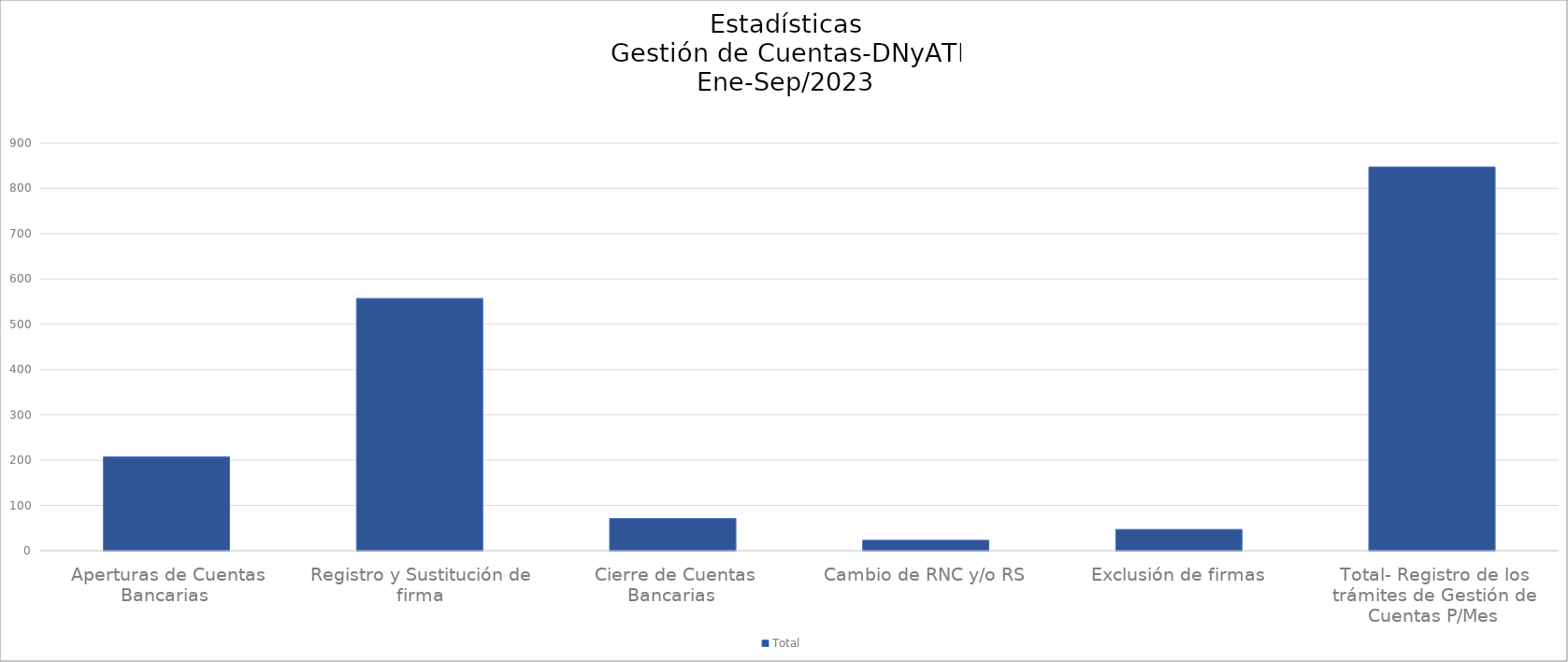
| Category | Total |
|---|---|
| Aperturas de Cuentas Bancarias  | 207 |
| Registro y Sustitución de firma | 557 |
| Cierre de Cuentas Bancarias  | 71 |
| Cambio de RNC y/o RS | 23 |
| Exclusión de firmas | 47 |
| Total- Registro de los trámites de Gestión de Cuentas P/Mes | 847 |